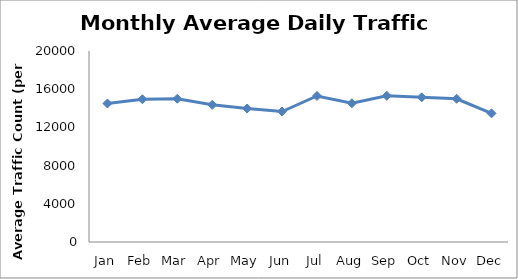
| Category | Series 0 |
|---|---|
| Jan | 14505 |
| Feb | 14949.25 |
| Mar | 15002 |
| Apr | 14364.75 |
| May | 13977 |
| Jun | 13660 |
| Jul | 15292.75 |
| Aug | 14528 |
| Sep | 15308.25 |
| Oct | 15151.75 |
| Nov | 14995.5 |
| Dec | 13472 |